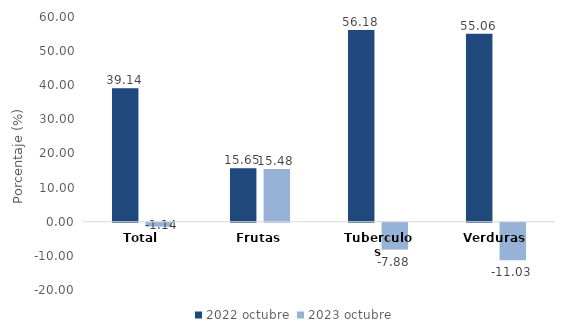
| Category | 2022 | 2023 |
|---|---|---|
| Total | 39.136 | -1.139 |
| Frutas | 15.649 | 15.483 |
| Tuberculos | 56.183 | -7.88 |
| Verduras | 55.061 | -11.025 |